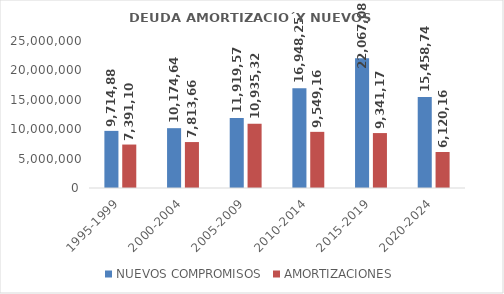
| Category | NUEVOS COMPROMISOS | AMORTIZACIONES |
|---|---|---|
| 1995-1999 | 9714881 | 7391108 |
| 2000-2004 | 10174646 | 7813666 |
| 2005-2009 | 11919574 | 10935323 |
| 2010-2014 | 16948250.309 | 9549160.637 |
| 2015-2019 | 22067087.738 | 9341175.502 |
| 2020-2024 | 15458740.47 | 6120162.771 |